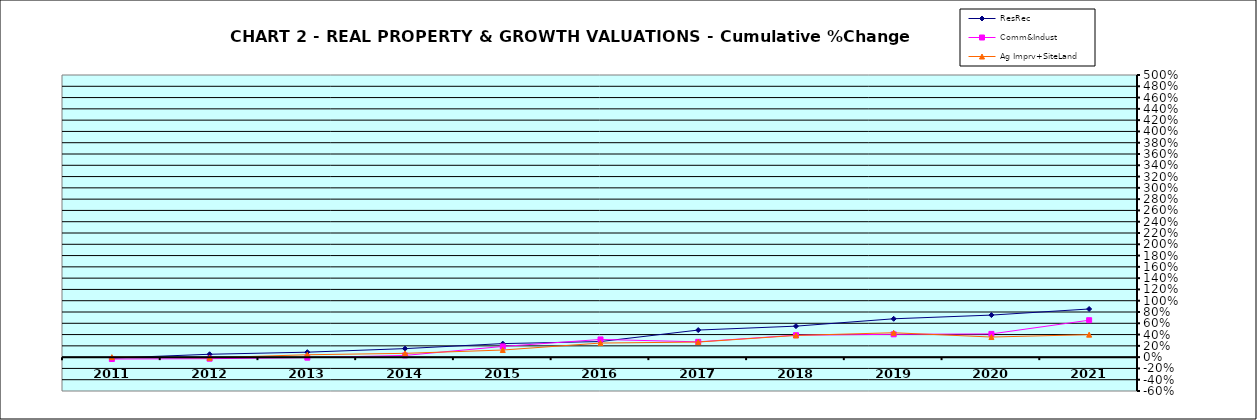
| Category | ResRec | Comm&Indust | Ag Imprv+SiteLand |
|---|---|---|---|
| 2011.0 | -0.016 | -0.033 | 0 |
| 2012.0 | 0.051 | -0.027 | -0.011 |
| 2013.0 | 0.088 | -0.009 | 0.042 |
| 2014.0 | 0.151 | 0.03 | 0.067 |
| 2015.0 | 0.24 | 0.19 | 0.126 |
| 2016.0 | 0.277 | 0.313 | 0.25 |
| 2017.0 | 0.48 | 0.271 | 0.267 |
| 2018.0 | 0.549 | 0.389 | 0.385 |
| 2019.0 | 0.68 | 0.405 | 0.432 |
| 2020.0 | 0.745 | 0.412 | 0.356 |
| 2021.0 | 0.853 | 0.655 | 0.399 |